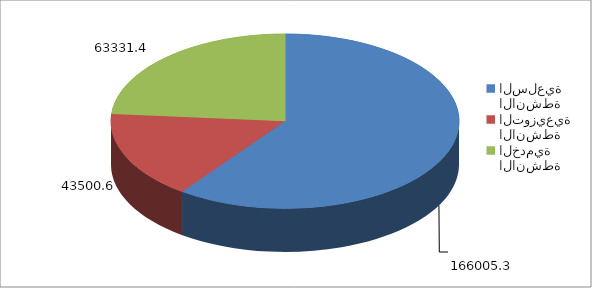
| Category | Series 0 |
|---|---|
| الانشطة السلعية | 160518.5 |
| الانشطة التوزيعية | 43500.6 |
| الانشطة الخدمية | 63331.4 |